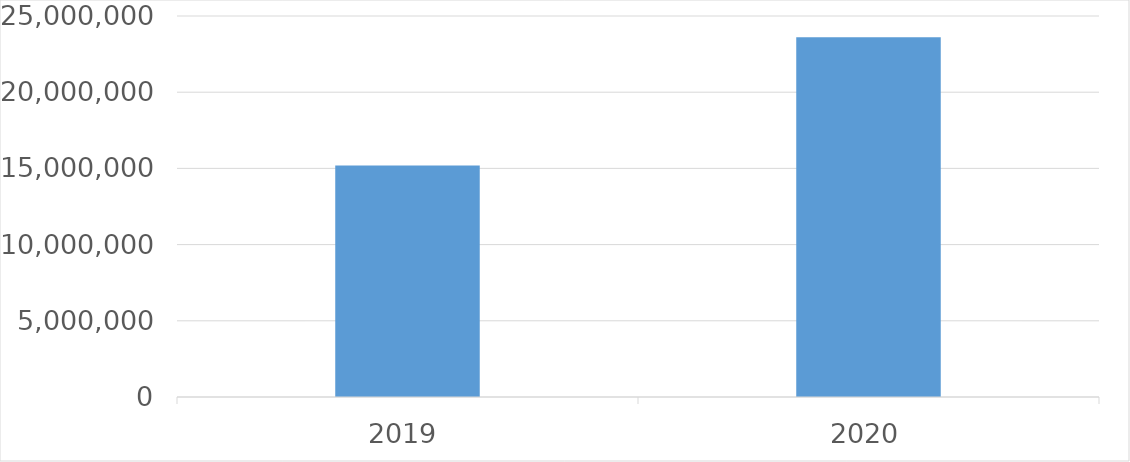
| Category | Series 0 |
|---|---|
| 2019 | 15191931 |
| 2020 | 23611590 |